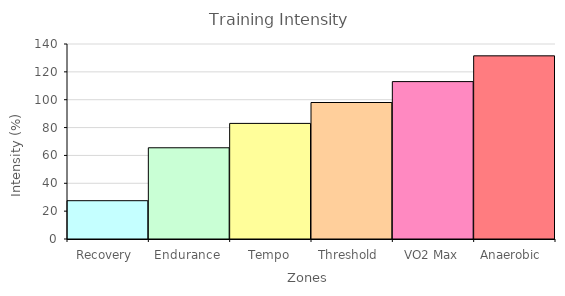
| Category | Series 0 |
|---|---|
| Recovery  | 27.5 |
| Endurance | 65.5 |
| Tempo | 83 |
| Threshold  | 98 |
| VO2 Max | 113 |
| Anaerobic  | 131.5 |